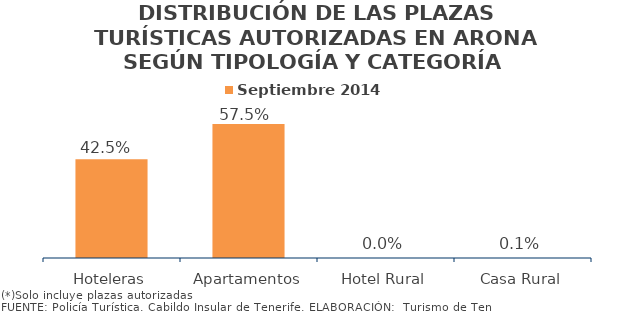
| Category | Septiembre 2014 |
|---|---|
| Hoteleras | 0.425 |
| Apartamentos | 0.575 |
| Hotel Rural | 0 |
| Casa Rural | 0.001 |